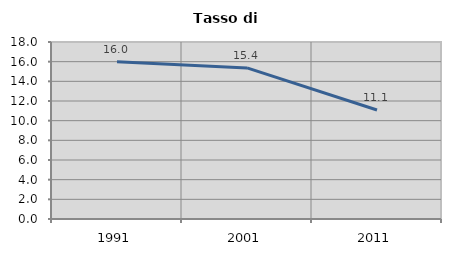
| Category | Tasso di disoccupazione   |
|---|---|
| 1991.0 | 15.983 |
| 2001.0 | 15.367 |
| 2011.0 | 11.081 |